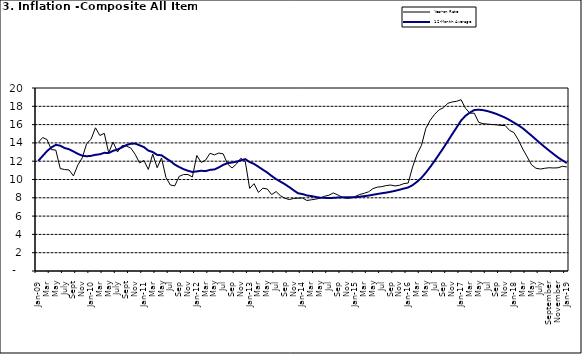
| Category | Year-on Rate | 12-Month Average |
|---|---|---|
| Jan-09 | 14.034 | 12.032 |
| Feb | 14.584 | 12.567 |
| Mar | 14.366 | 13.101 |
| Apr | 13.268 | 13.51 |
| May | 13.212 | 13.787 |
| June | 11.194 | 13.694 |
| July | 11.09 | 13.437 |
| Aug | 11.046 | 13.307 |
| Sept | 10.39 | 13.065 |
| Oct | 11.588 | 12.803 |
| Nov | 12.368 | 12.609 |
| Dec | 13.93 | 12.538 |
| Jan-10 | 14.398 | 12.586 |
| Feb | 15.649 | 12.7 |
| Mar | 14.812 | 12.757 |
| Apr | 15.044 | 12.915 |
| May | 12.915 | 12.893 |
| June | 14.099 | 13.132 |
| July | 13.002 | 13.284 |
| Aug | 13.702 | 13.5 |
| Sept | 13.65 | 13.764 |
| Oct | 13.45 | 13.908 |
| Nov | 12.766 | 13.928 |
| Dec | 11.815 | 13.74 |
| Jan-11 | 12.08 | 13.542 |
| Feb | 11.1 | 13.161 |
| Mar | 12.779 | 13.001 |
| Apr | 11.291 | 12.694 |
| May | 12.352 | 12.648 |
| Jun | 10.23 | 12.321 |
| Jul | 9.397 | 12.009 |
| Aug | 9.301 | 11.635 |
| Sep | 10.339 | 11.363 |
| Oct | 10.544 | 11.13 |
| Nov | 10.54 | 10.952 |
| Dec | 10.283 | 10.826 |
| Jan-12 | 12.626 | 10.886 |
| Feb | 11.866 | 10.955 |
| Mar | 12.111 | 10.914 |
| Apr | 12.866 | 11.054 |
| May | 12.688 | 11.096 |
| Jun | 12.892 | 11.32 |
| Jul | 12.797 | 11.599 |
| Aug | 11.689 | 11.791 |
| Sep | 11.253 | 11.859 |
| Oct | 11.693 | 11.948 |
| Nov | 12.32 | 12.091 |
| Dec | 11.981 | 12.224 |
| Jan-13 | 9.031 | 11.908 |
| Feb | 9.542 | 11.703 |
| Mar | 8.593 | 11.394 |
| Apr | 9.052 | 11.072 |
| May | 8.964 | 10.761 |
| Jun | 8.353 | 10.383 |
| Jul | 8.682 | 10.047 |
| Aug | 8.231 | 9.761 |
| Sep | 7.952 | 9.486 |
| Oct | 7.807 | 9.167 |
| Nov | 7.931 | 8.815 |
| Dec | 7.957 | 8.496 |
| Jan-14 | 7.977 | 8.408 |
| Feb | 7.707 | 8.257 |
| Mar | 7.783 | 8.19 |
| Apr | 7.851 | 8.092 |
| May | 7.965 | 8.012 |
| Jun | 8.167 | 7.998 |
| Jul | 8.281 | 7.968 |
| Aug | 8.534 | 7.996 |
| Sep | 8.317 | 8.027 |
| Oct | 8.06 | 8.047 |
| Nov | 7.927 | 8.046 |
| Dec | 7.978 | 8.047 |
| Jan-15 | 8.157 | 8.063 |
| Feb | 8.359 | 8.117 |
| Mar | 8.494 | 8.176 |
| Apr | 8.655 | 8.243 |
| May | 9.003 | 8.331 |
| Jun | 9.168 | 8.417 |
| Jul | 9.218 | 8.497 |
| Aug | 9.336 | 8.566 |
| Sep | 9.394 | 8.658 |
| Oct | 9.296 | 8.76 |
| Nov | 9.368 | 8.879 |
| Dec | 9.554 | 9.009 |
| Jan-16 | 9.617 | 9.13 |
| Feb | 11.379 | 9.386 |
| Mar | 12.775 | 9.751 |
| Apr | 13.721 | 10.182 |
| May | 15.577 | 10.746 |
| Jun | 16.48 | 11.372 |
| Jul | 17.127 | 12.045 |
| Aug | 17.609 | 12.744 |
| Sep | 17.852 | 13.454 |
| Oct | 18.33 | 14.206 |
| Nov | 18.476 | 14.958 |
| Dec | 18.547 | 15.697 |
| Jan-17 | 18.719 | 16.441 |
| Feb | 17.78 | 16.958 |
| Mar | 17.256 | 17.315 |
| Apr | 17.244 | 17.591 |
| May | 16.251 | 17.628 |
| Jun | 16.098 | 17.578 |
| Jul | 16.053 | 17.475 |
| Aug | 16.012 | 17.331 |
| Sep | 15.979 | 17.17 |
| Oct | 15.905 | 16.968 |
| Nov | 15.901 | 16.76 |
| Dec | 15.372 | 16.502 |
| Jan-18 | 15.127 | 16.215 |
| Feb | 14.33 | 15.93 |
| Mar | 13.337 | 15.599 |
| Apr | 12.482 | 15.196 |
| May | 11.608 | 14.793 |
| June | 11.231 | 14.371 |
| July | 11.142 | 13.95 |
| August | 11.227 | 13.546 |
| September | 11.284 | 13.157 |
| October | 11.259 | 12.777 |
| November | 11.281 | 12.406 |
| December | 11.442 | 12.095 |
| Jan-19 | 11.374 | 11.801 |